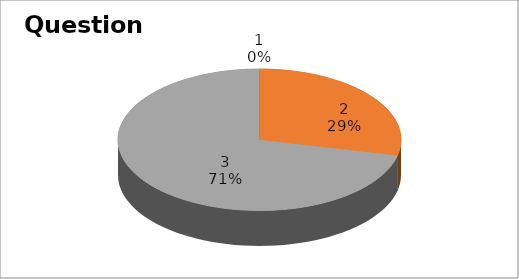
| Category | Series 0 |
|---|---|
| 0 | 0 |
| 1 | 4 |
| 2 | 10 |